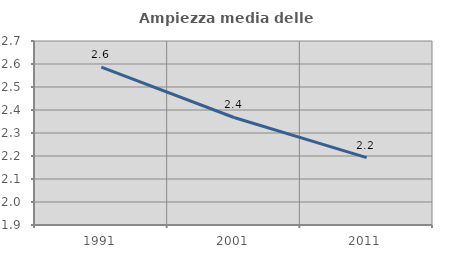
| Category | Ampiezza media delle famiglie |
|---|---|
| 1991.0 | 2.586 |
| 2001.0 | 2.368 |
| 2011.0 | 2.193 |